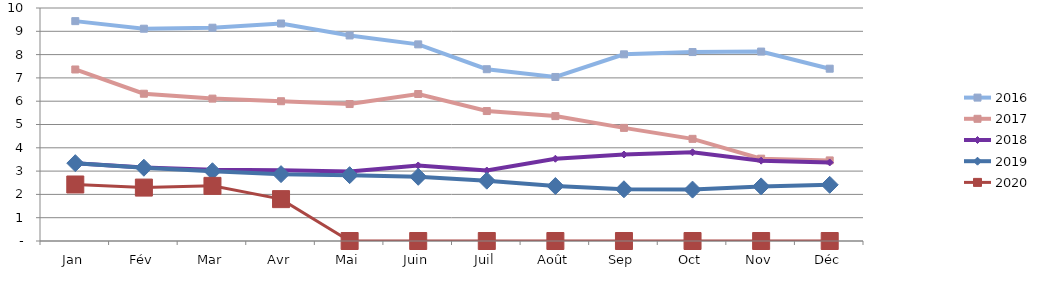
| Category | 2015 | 2016 | 2017 | 2018 | 2019 | 2020 |
|---|---|---|---|---|---|---|
| Jan |  | 9.436 | 7.361 | 3.34 | 3.341 | 2.425 |
| Fév |  | 9.111 | 6.321 | 3.159 | 3.145 | 2.293 |
| Mar |  | 9.154 | 6.111 | 3.062 | 2.994 | 2.366 |
| Avr |  | 9.335 | 5.999 | 3.031 | 2.87 | 1.797 |
| Mai |  | 8.821 | 5.878 | 2.984 | 2.827 | 0 |
| Juin |  | 8.439 | 6.309 | 3.242 | 2.755 | 0 |
| Juil |  | 7.373 | 5.577 | 3.025 | 2.589 | 0 |
| Août |  | 7.04 | 5.36 | 3.53 | 2.359 | 0 |
| Sep |  | 8.012 | 4.855 | 3.712 | 2.22 | 0 |
| Oct |  | 8.109 | 4.384 | 3.806 | 2.206 | 0 |
| Nov |  | 8.13 | 3.533 | 3.449 | 2.343 | 0 |
| Déc |  | 7.395 | 3.458 | 3.371 | 2.411 | 0 |